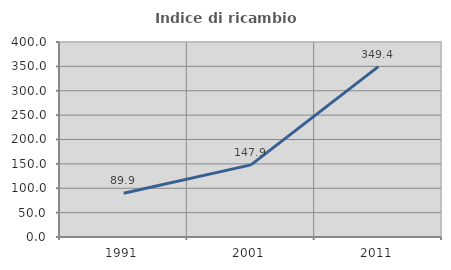
| Category | Indice di ricambio occupazionale  |
|---|---|
| 1991.0 | 89.866 |
| 2001.0 | 147.903 |
| 2011.0 | 349.363 |